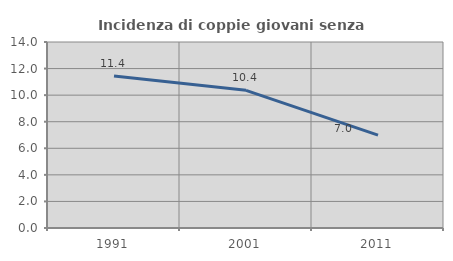
| Category | Incidenza di coppie giovani senza figli |
|---|---|
| 1991.0 | 11.442 |
| 2001.0 | 10.364 |
| 2011.0 | 6.996 |